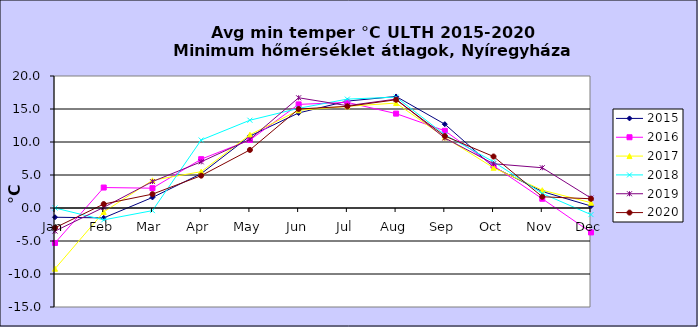
| Category | 2015 | 2016 | 2017 | 2018 | 2019 | 2020 |
|---|---|---|---|---|---|---|
| Jan | -1.4 | -5.3 | -9.2 | 0 | -3.5 | -3 |
| Feb | -1.5 | 3.1 | -0.6 | -1.8 | 0.1 | 0.6 |
| Mar | 1.6 | 3 | 4.2 | -0.4 | 4 | 2.1 |
| Apr | 5.2 | 7.4 | 5.5 | 10.3 | 7 | 4.9 |
| May | 10.9 | 10.3 | 11.1 | 13.3 | 10.4 | 8.8 |
| Jun | 14.4 | 15.7 | 14.8 | 15.1 | 16.7 | 15 |
| Jul | 16.2 | 16 | 15.4 | 16.5 | 15.5 | 15.4 |
| Aug | 16.9 | 14.3 | 15.9 | 16.8 | 16.5 | 16.4 |
| Sep | 12.7 | 11.7 | 10.7 | 11.1 | 10.6 | 10.9 |
| Oct | 6.2 | 6.4 | 6.1 | 7 | 6.7 | 7.8 |
| Nov | 2.5 | 1.4 | 2.7 | 2.2 | 6.1 | 1.7 |
| Dec | 0.3 | -3.7 | 0.8 | -1 | 1.5 | 1.4 |